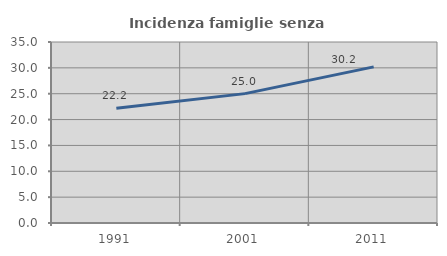
| Category | Incidenza famiglie senza nuclei |
|---|---|
| 1991.0 | 22.194 |
| 2001.0 | 25.019 |
| 2011.0 | 30.195 |